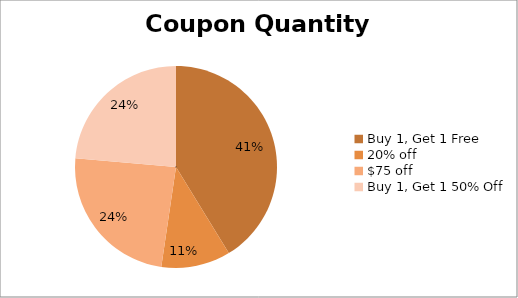
| Category | Coupon Quantity Redeemed |
|---|---|
| Buy 1, Get 1 Free | 398 |
| 20% off | 107 |
| $75 off | 232 |
| Buy 1, Get 1 50% Off | 228 |